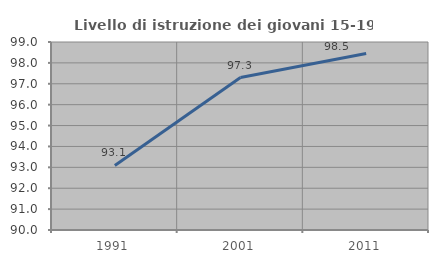
| Category | Livello di istruzione dei giovani 15-19 anni |
|---|---|
| 1991.0 | 93.089 |
| 2001.0 | 97.297 |
| 2011.0 | 98.454 |